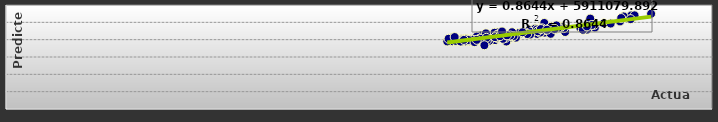
| Category | Series 0 |
|---|---|
| 50804292.0 | 49439905.935 |
| 45781904.0 | 44066931.088 |
| 47524280.0 | 44416988.476 |
| 41210368.0 | 39866473.386 |
| 40641592.0 | 39432755.357 |
| 42946556.0 | 41279784.664 |
| 53131848.0 | 53975166.501 |
| 50050572.0 | 46987961.977 |
| 42522856.0 | 38913523.166 |
| 41089492.0 | 39655543.659 |
| 41565420.0 | 39755366.398 |
| 45507120.0 | 45359905.022 |
| 47398740.0 | 46641943.46 |
| 43676184.0 | 43520993.869 |
| 42461220.0 | 41027093.758 |
| 38951924.0 | 40051332.52 |
| 40347076.0 | 40312390.609 |
| 43608316.0 | 43870478.227 |
| 52491400.0 | 53397091.451 |
| 49375116.0 | 45784291.928 |
| 41060276.0 | 39294760.751 |
| 40873720.0 | 39571685.398 |
| 43236856.0 | 41378126.898 |
| 45273400.0 | 45260287.245 |
| 48805164.0 | 46880160.094 |
| 44143448.0 | 43991856.578 |
| 44262820.0 | 44226415.873 |
| 39050552.0 | 40042670.008 |
| 38719228.0 | 40331872.337 |
| 40344360.0 | 42407527.782 |
| 49578784.0 | 49853832.745 |
| 45746916.0 | 49646541.467 |
| 39397076.0 | 39040129.62 |
| 39904312.0 | 39685224.863 |
| 42170680.0 | 41786704.784 |
| 47174228.0 | 47444661.86 |
| 51390000.0 | 49275320.425 |
| 45472280.0 | 45487568.824 |
| 46765108.0 | 46202891.541 |
| 39341380.0 | 40021013.951 |
| 37926096.0 | 39076941.18 |
| 41733660.0 | 44165776.929 |
| 45150484.0 | 43312166.789 |
| 44137108.0 | 44094902.339 |
| 39520400.0 | 39141937.119 |
| 39263904.0 | 40053120.04 |
| 41745116.0 | 41858891.643 |
| 44479592.0 | 45775701.153 |
| 49496248.0 | 49109290.65 |
| 47018548.0 | 47338440.062 |
| 45732924.0 | 45404505.058 |
| 38385208.0 | 39899740.116 |
| 37933228.0 | 41141735.411 |
| 39581568.0 | 40299803.28 |
| 46086620.0 | 46059666.434 |
| 45391564.0 | 44094902.339 |
| 43332896.0 | 41159088.075 |
| 38424544.0 | 39941267.072 |
| 38849892.0 | 40064326.066 |
| 41514400.0 | 44002792.075 |
| 46346808.0 | 47456211.581 |
| 43010724.0 | 44299167.68 |
| 41715724.0 | 42687391.513 |
| 38183392.0 | 40680802.017 |
| 37905008.0 | 40880462.094 |
| 41731484.0 | 42534091.257 |
| 49651544.0 | 52165991.163 |
| 53420000.0 | 54044359.375 |
| 42224924.0 | 40484374.578 |
| 38494852.0 | 39591245.366 |
| 39128468.0 | 40285218.119 |
| 44968072.0 | 46358971.325 |
| 45563984.0 | 46542326.123 |
| 40006268.0 | 41793045.033 |
| 44075608.0 | 44224971.607 |
| 37499468.0 | 38965566.127 |
| 38224944.0 | 39293623.2 |
| 40787416.0 | 43642732.079 |
| 46945436.0 | 46889893.592 |
| 46291216.0 | 43371390.294 |
| 41724060.0 | 41070349.899 |
| 39047668.0 | 39048203.017 |
| 41779656.0 | 41291502.667 |
| 46781760.0 | 48237273.042 |
| 49984440.0 | 48521689.442 |
| 42540524.0 | 42551007.051 |
| 44585032.0 | 44548369.087 |
| 41562096.0 | 41463307.303 |
| 39028400.0 | 40442160.039 |
| 41986096.0 | 42025043.578 |
| 53081244.0 | 51843079.84 |
| 52182220.0 | 50503896.189 |
| 44539876.0 | 42964386.606 |
| 40825888.0 | 41055728.564 |
| 43133192.0 | 42062458.232 |
| 45120216.0 | 45914300.451 |
| 49781960.0 | 48453833.618 |
| 44300280.0 | 43236782.211 |
| 45198752.0 | 44841447.558 |
| 39650440.0 | 39958933.428 |
| 38645132.0 | 38897308.456 |
| 40266460.0 | 40589508.797 |
| 52282280.0 | 52478812.422 |
| 49027500.0 | 45703533.829 |
| 40657028.0 | 36767958.028 |
| 39301848.0 | 39790663.133 |
| 42865196.0 | 42393074.399 |
| 45454040.0 | 46119310.425 |
| 46627280.0 | 46145298.399 |
| 43893612.0 | 44296280.91 |
| 42577132.0 | 42470830.936 |
| 37611548.0 | 40519103.277 |
| 38131292.0 | 41510174.037 |
| 42157080.0 | 44729564.796 |
| 54824440.0 | 54971286.27 |
| 49369900.0 | 47638055.305 |
| 39821248.0 | 38579501.579 |
| 38909224.0 | 39853335.608 |
| 40007616.0 | 39888190.395 |
| 45977612.0 | 45769926.733 |